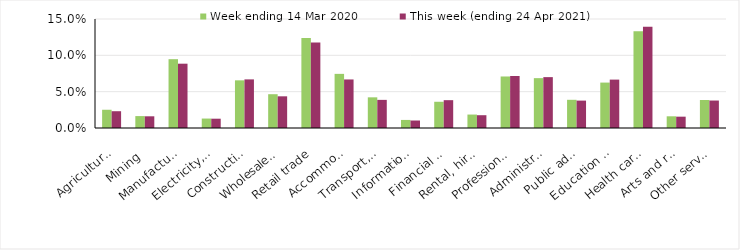
| Category | Week ending 14 Mar 2020 | This week (ending 24 Apr 2021) |
|---|---|---|
| Agriculture, forestry and fishing | 0.025 | 0.023 |
| Mining | 0.016 | 0.016 |
| Manufacturing | 0.095 | 0.088 |
| Electricity, gas, water and waste services | 0.013 | 0.013 |
| Construction | 0.066 | 0.067 |
| Wholesale trade | 0.046 | 0.044 |
| Retail trade | 0.124 | 0.118 |
| Accommodation and food services | 0.074 | 0.067 |
| Transport, postal and warehousing | 0.042 | 0.039 |
| Information media and telecommunications | 0.011 | 0.01 |
| Financial and insurance services | 0.036 | 0.038 |
| Rental, hiring and real estate services | 0.018 | 0.018 |
| Professional, scientific and technical services | 0.071 | 0.072 |
| Administrative and support services | 0.069 | 0.07 |
| Public administration and safety | 0.039 | 0.038 |
| Education and training | 0.062 | 0.067 |
| Health care and social assistance | 0.133 | 0.139 |
| Arts and recreation services | 0.016 | 0.016 |
| Other services | 0.038 | 0.038 |